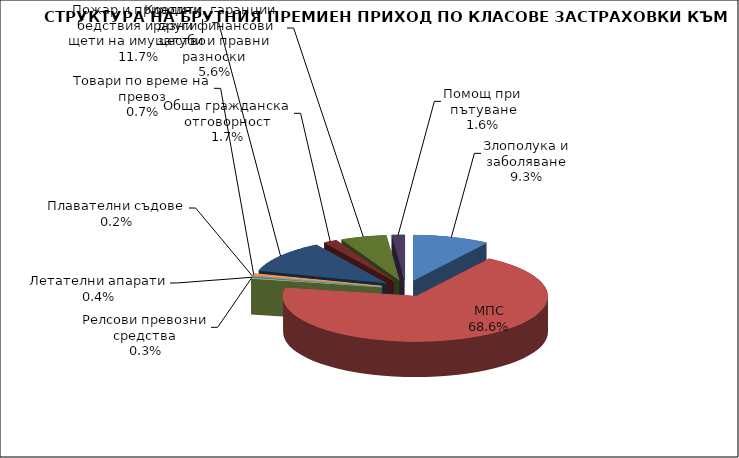
| Category | Злополука и заболяване |
|---|---|
| Злополука и заболяване | 0.093 |
| МПС | 0.686 |
| Релсови превозни средства | 0.003 |
| Летателни апарати | 0.004 |
| Плавателни съдове | 0.002 |
| Товари по време на превоз | 0.007 |
| Пожар и природни бедствия и други щети на имущество | 0.117 |
| Обща гражданска отговорност | 0.017 |
| Кредити, гаранции, разни финансови загуби и правни разноски | 0.056 |
| Помощ при пътуване | 0.016 |